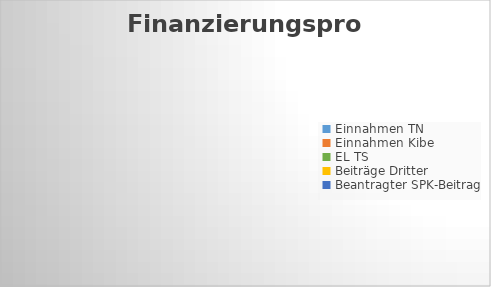
| Category | Series 0 |
|---|---|
| Einnahmen TN | 0 |
| Einnahmen Kibe | 0 |
| EL TS | 0 |
| Beiträge Dritter | 0 |
| Beantragter SPK-Beitrag | 0 |